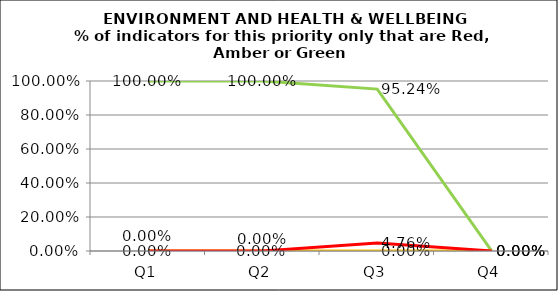
| Category | Green | Amber | Red |
|---|---|---|---|
| Q1 | 1 | 0 | 0 |
| Q2 | 1 | 0 | 0 |
| Q3 | 0.952 | 0 | 0.048 |
| Q4 | 0 | 0 | 0 |